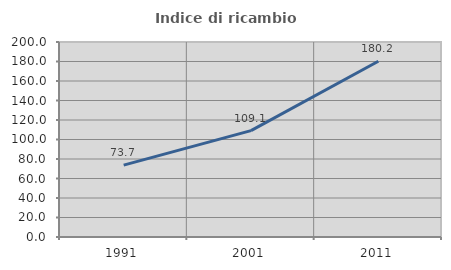
| Category | Indice di ricambio occupazionale  |
|---|---|
| 1991.0 | 73.697 |
| 2001.0 | 109.062 |
| 2011.0 | 180.242 |